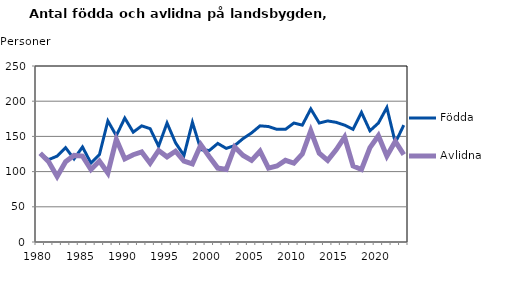
| Category | Födda | Avlidna |
|---|---|---|
| 1980.0 | 125 | 126 |
| 1981.0 | 117 | 114 |
| 1982.0 | 122 | 93 |
| 1983.0 | 134 | 114 |
| 1984.0 | 118 | 123 |
| 1985.0 | 135 | 122 |
| 1986.0 | 112 | 103 |
| 1987.0 | 124 | 115 |
| 1988.0 | 172 | 98 |
| 1989.0 | 151 | 146 |
| 1990.0 | 176 | 118 |
| 1991.0 | 156 | 124 |
| 1992.0 | 165 | 128 |
| 1993.0 | 161 | 112 |
| 1994.0 | 136 | 130 |
| 1995.0 | 169 | 121 |
| 1996.0 | 141 | 129 |
| 1997.0 | 123 | 115 |
| 1998.0 | 170 | 111 |
| 1999.0 | 131 | 138 |
| 2000.0 | 130 | 121 |
| 2001.0 | 140 | 105 |
| 2002.0 | 133 | 103 |
| 2003.0 | 137 | 135 |
| 2004.0 | 147 | 123 |
| 2005.0 | 155 | 116 |
| 2006.0 | 165 | 129 |
| 2007.0 | 164 | 105 |
| 2008.0 | 160 | 108 |
| 2009.0 | 160 | 116 |
| 2010.0 | 169 | 112 |
| 2011.0 | 166 | 125 |
| 2012.0 | 189 | 158 |
| 2013.0 | 169 | 126 |
| 2014.0 | 172 | 116 |
| 2015.0 | 170 | 131 |
| 2016.0 | 166 | 149 |
| 2017.0 | 160 | 108 |
| 2018.0 | 184 | 103 |
| 2019.0 | 158 | 134 |
| 2020.0 | 169 | 151 |
| 2021.0 | 191 | 122 |
| 2022.0 | 141 | 143 |
| 2023.0 | 166 | 124 |